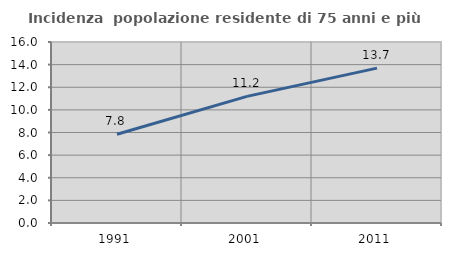
| Category | Incidenza  popolazione residente di 75 anni e più |
|---|---|
| 1991.0 | 7.847 |
| 2001.0 | 11.193 |
| 2011.0 | 13.69 |